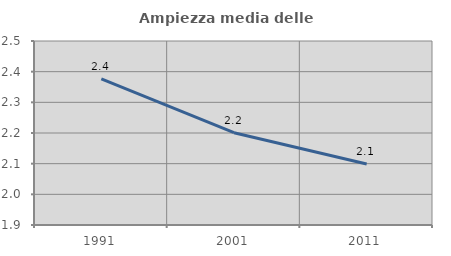
| Category | Ampiezza media delle famiglie |
|---|---|
| 1991.0 | 2.376 |
| 2001.0 | 2.201 |
| 2011.0 | 2.099 |